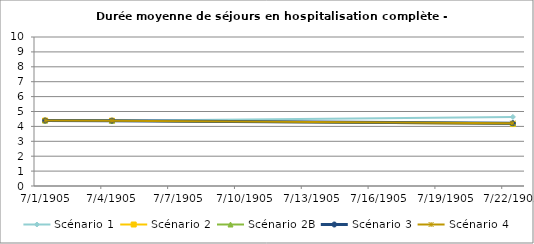
| Category | Scénario 1 | Scénario 2 | Scénario 2B | Scénario 3 | Scénario 4 |
|---|---|---|---|---|---|
| 2009.0 | 4.395 | 4.395 | 4.395 | 4.395 | 4.395 |
| 2012.0 | 4.386 | 4.386 | 4.386 | 4.386 | 4.386 |
| 2030.0 | 4.636 | 4.156 | 4.216 | 4.216 | 4.216 |